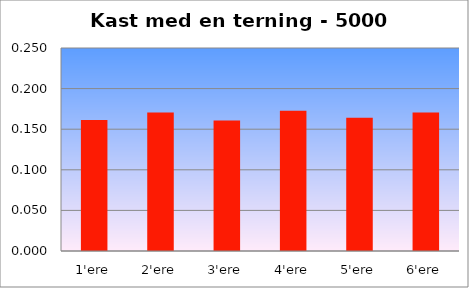
| Category | Rel. frek. |
|---|---|
| 1'ere | 0.161 |
| 2'ere | 0.171 |
| 3'ere | 0.161 |
| 4'ere | 0.173 |
| 5'ere | 0.164 |
| 6'ere | 0.171 |